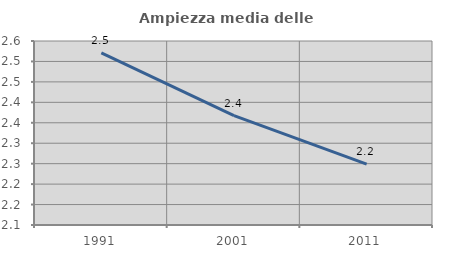
| Category | Ampiezza media delle famiglie |
|---|---|
| 1991.0 | 2.521 |
| 2001.0 | 2.368 |
| 2011.0 | 2.249 |